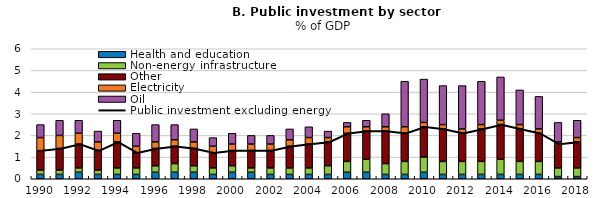
| Category | Health and education | Non-energy infrastructure | Other | Electricity | Oil |
|---|---|---|---|---|---|
| 1990.0 | 0.2 | 0.2 | 0.9 | 0.6 | 0.6 |
| 1991.0 | 0.2 | 0.2 | 1 | 0.6 | 0.7 |
| 1992.0 | 0.3 | 0.2 | 1.1 | 0.5 | 0.6 |
| 1993.0 | 0.2 | 0.2 | 0.9 | 0.4 | 0.5 |
| 1994.0 | 0.2 | 0.3 | 1.2 | 0.4 | 0.6 |
| 1995.0 | 0.2 | 0.3 | 0.7 | 0.3 | 0.6 |
| 1996.0 | 0.3 | 0.3 | 0.8 | 0.3 | 0.8 |
| 1997.0 | 0.3 | 0.4 | 0.8 | 0.3 | 0.7 |
| 1998.0 | 0.3 | 0.3 | 0.8 | 0.3 | 0.6 |
| 1999.0 | 0.2 | 0.3 | 0.7 | 0.3 | 0.4 |
| 2000.0 | 0.3 | 0.3 | 0.7 | 0.3 | 0.5 |
| 2001.0 | 0.3 | 0.2 | 0.8 | 0.3 | 0.4 |
| 2002.0 | 0.2 | 0.3 | 0.8 | 0.3 | 0.4 |
| 2003.0 | 0.2 | 0.3 | 1 | 0.3 | 0.5 |
| 2004.0 | 0.2 | 0.3 | 1.1 | 0.3 | 0.5 |
| 2005.0 | 0.2 | 0.4 | 1.1 | 0.2 | 0.3 |
| 2006.0 | 0.3 | 0.5 | 1.3 | 0.3 | 0.2 |
| 2007.0 | 0.3 | 0.6 | 1.3 | 0.2 | 0.3 |
| 2008.0 | 0.2 | 0.5 | 1.5 | 0.2 | 0.6 |
| 2009.0 | 0.2 | 0.6 | 1.3 | 0.3 | 2.1 |
| 2010.0 | 0.3 | 0.7 | 1.4 | 0.2 | 2 |
| 2011.0 | 0.2 | 0.6 | 1.5 | 0.2 | 1.8 |
| 2012.0 | 0.2 | 0.6 | 1.3 | 0.2 | 2 |
| 2013.0 | 0.2 | 0.6 | 1.5 | 0.2 | 2 |
| 2014.0 | 0.2 | 0.7 | 1.6 | 0.2 | 2 |
| 2015.0 | 0.2 | 0.6 | 1.5 | 0.2 | 1.6 |
| 2016.0 | 0.2 | 0.6 | 1.3 | 0.2 | 1.5 |
| 2017.0 | 0.1 | 0.4 | 1.1 | 0.1 | 0.9 |
| 2018.0 | 0.1 | 0.4 | 1.2 | 0.2 | 0.8 |